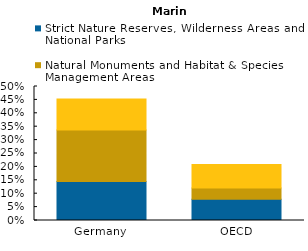
| Category | Strict Nature Reserves, Wilderness Areas and National Parks | Natural Monuments and Habitat & Species Management Areas | Protected areas with sustainable use of natural resources and areas with no management category provided |
|---|---|---|---|
| Germany | 0.145 | 0.192 | 0.116 |
| OECD | 0.079 | 0.042 | 0.088 |